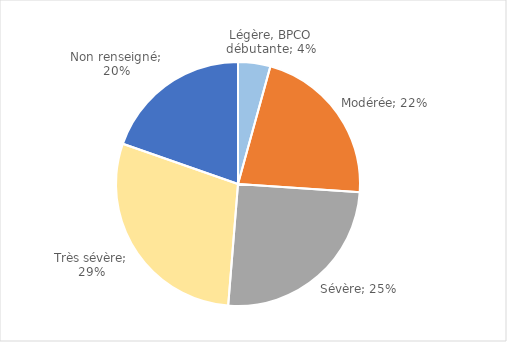
| Category | Series 0 |
|---|---|
| Légère, BPCO débutante | 0.043 |
| Modérée | 0.218 |
| Sévère | 0.252 |
| Très sévère | 0.291 |
| Non renseigné | 0.197 |